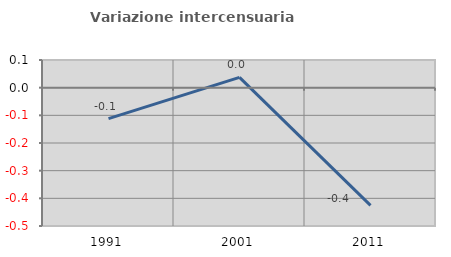
| Category | Variazione intercensuaria annua |
|---|---|
| 1991.0 | -0.112 |
| 2001.0 | 0.037 |
| 2011.0 | -0.425 |